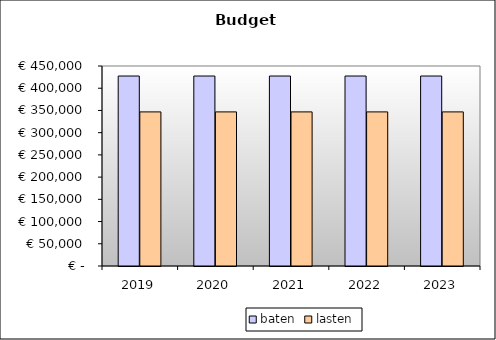
| Category | baten | lasten |
|---|---|---|
| 2019.0 | 427459.762 | 346726.02 |
| 2020.0 | 427459.762 | 346726.02 |
| 2021.0 | 427459.762 | 346726.02 |
| 2022.0 | 427459.762 | 346726.02 |
| 2023.0 | 427459.762 | 346726.02 |